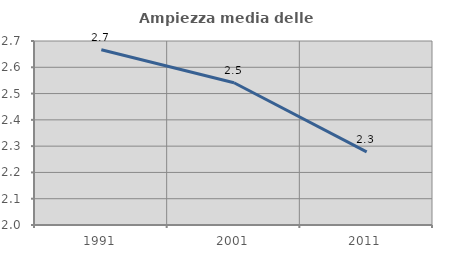
| Category | Ampiezza media delle famiglie |
|---|---|
| 1991.0 | 2.667 |
| 2001.0 | 2.541 |
| 2011.0 | 2.278 |